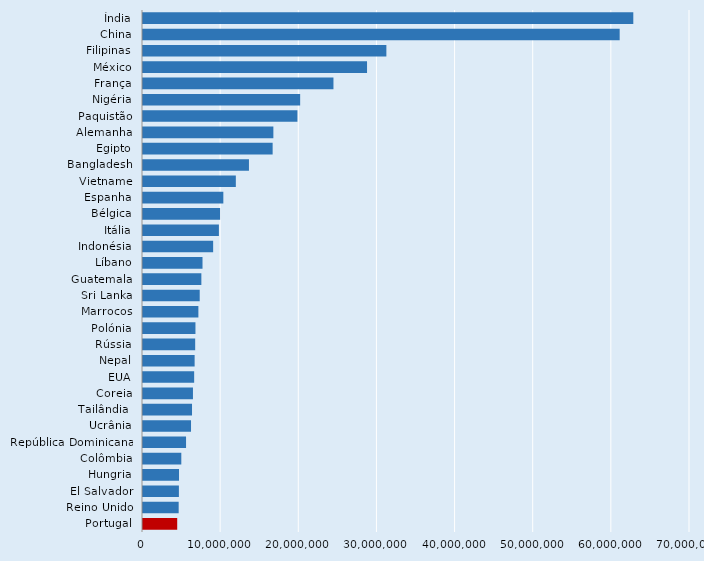
| Category | Series 0 |
|---|---|
| Índia | 62744364.288 |
| China | 60999999.488 |
| Filipinas | 31144631.808 |
| México | 28670114.304 |
| França | 24373082.432 |
| Nigéria | 20112097.816 |
| Paquistão | 19761000.064 |
| Alemanha | 16683183.526 |
| Egipto | 16590000.128 |
| Bangladesh | 13559364.27 |
| Vietname | 11880000 |
| Espanha | 10280787.456 |
| Bélgica | 9867254.28 |
| Itália | 9712828.672 |
| Indonésia | 8976778.128 |
| Líbano | 7615622.016 |
| Guatemala | 7468599.808 |
| Sri Lanka | 7257361.392 |
| Marrocos | 7087744 |
| Polónia | 6712000 |
| Rússia | 6678019.84 |
| Nepal | 6606795.584 |
| EUA | 6546999.808 |
| Coreia | 6393399.808 |
| Tailândia  | 6272839.936 |
| Ucrânia | 6145999.872 |
| República Dominicana | 5509000.064 |
| Colômbia | 4902694.056 |
| Hungria | 4609248.768 |
| El Salvador | 4593757.162 |
| Reino Unido | 4564740.992 |
| Portugal | 4377748.16 |